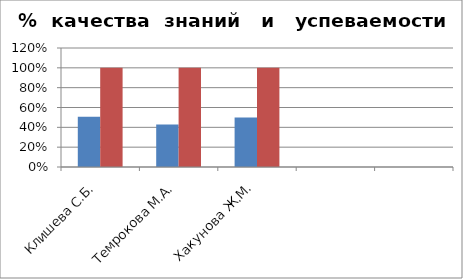
| Category | Series 0 | 2 |
|---|---|---|
| Клишева С.Б. | 0.506 | 1 |
| Темрокова М.А. | 0.429 | 1 |
| Хакунова Ж.М. | 0.5 | 1 |